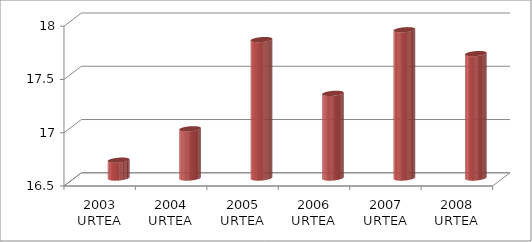
| Category | Series 0 | Series 1 |
|---|---|---|
| 2003 URTEA |  | 16.667 |
| 2004 URTEA |  | 16.962 |
| 2005 URTEA |  | 17.799 |
| 2006 URTEA |  | 17.295 |
| 2007 URTEA |  | 17.891 |
| 2008 URTEA |  | 17.668 |